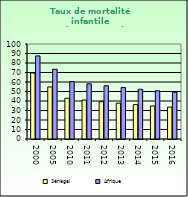
| Category | Sénégal | Afrique                        |
|---|---|---|
| 2000.0 | 69.5 | 87.462 |
| 2005.0 | 54.8 | 73.418 |
| 2010.0 | 42.9 | 60.345 |
| 2011.0 | 41 | 58.107 |
| 2012.0 | 39.3 | 56.032 |
| 2013.0 | 37.7 | 54.131 |
| 2014.0 | 36.2 | 52.336 |
| 2015.0 | 34.8 | 50.754 |
| 2016.0 | 33.6 | 49.283 |